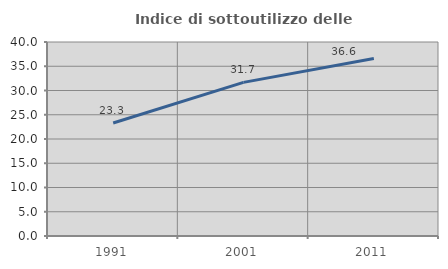
| Category | Indice di sottoutilizzo delle abitazioni  |
|---|---|
| 1991.0 | 23.309 |
| 2001.0 | 31.678 |
| 2011.0 | 36.607 |